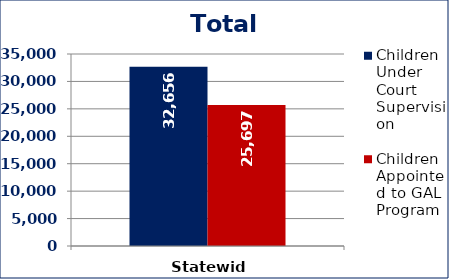
| Category | Children Under Court Supervision  | Children Appointed to GAL Program  |
|---|---|---|
| Statewide | 32656 | 25697 |